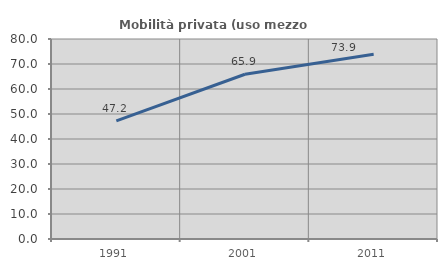
| Category | Mobilità privata (uso mezzo privato) |
|---|---|
| 1991.0 | 47.217 |
| 2001.0 | 65.894 |
| 2011.0 | 73.941 |